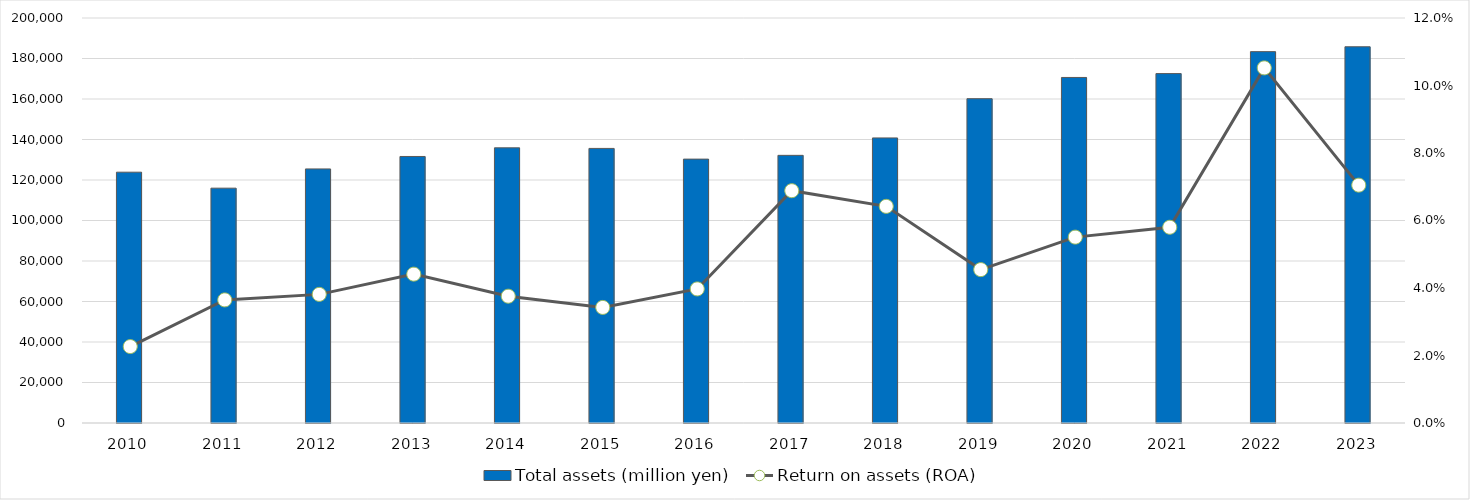
| Category | Total assets (million yen) |
|---|---|
| 2010 | 123862 |
| 2011 | 115969 |
| 2012 | 125469 |
| 2013 | 131618 |
| 2014 | 135890 |
| 2015 | 135596 |
| 2016 | 130315 |
| 2017 | 132171 |
| 2018 | 140776 |
| 2019 | 160158 |
| 2020 | 170638 |
| 2021 | 172553 |
| 2022 | 183391 |
| 2023 | 185797.085 |